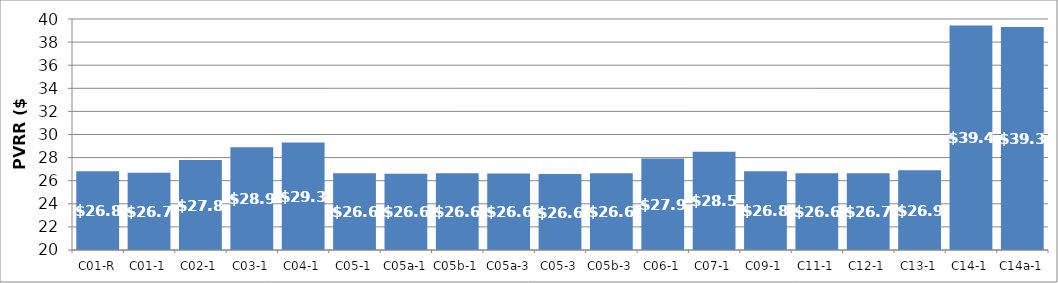
| Category | Series 0 |
|---|---|
| C01-R | 26.828 |
| C01-1 | 26.683 |
| C02-1 | 27.787 |
| C03-1 | 28.889 |
| C04-1 | 29.31 |
| C05-1 | 26.646 |
| C05a-1 | 26.591 |
| C05b-1 | 26.649 |
| C05a-3 | 26.615 |
| C05-3 | 26.578 |
| C05b-3 | 26.649 |
| C06-1 | 27.93 |
| C07-1 | 28.516 |
| C09-1 | 26.809 |
| C11-1 | 26.649 |
| C12-1 | 26.655 |
| C13-1 | 26.902 |
| C14-1 | 39.442 |
| C14a-1 | 39.304 |